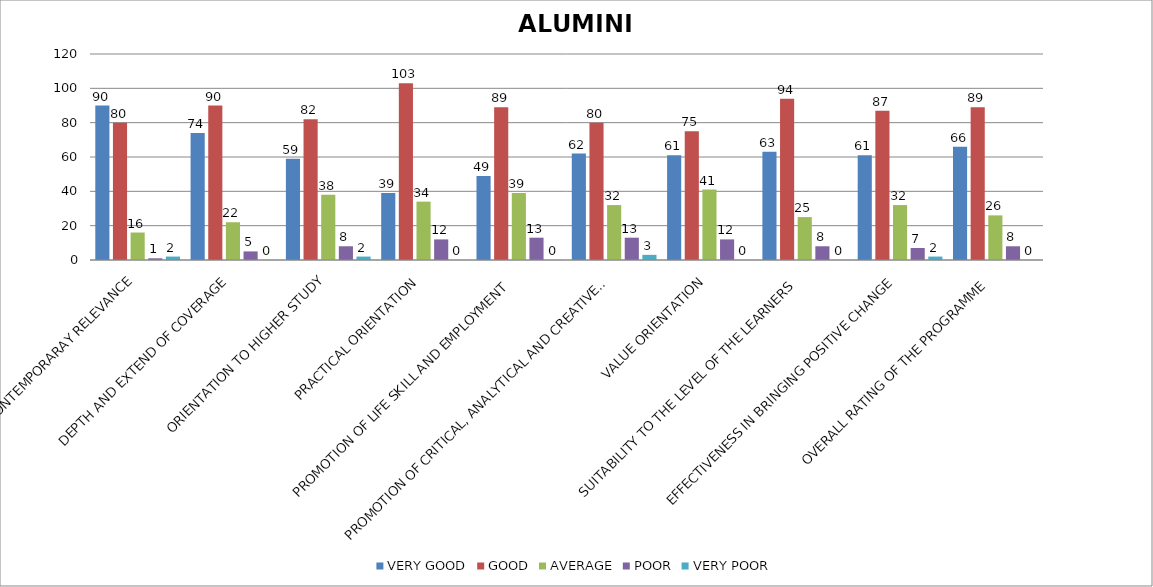
| Category | VERY GOOD | GOOD | AVERAGE | POOR | VERY POOR |
|---|---|---|---|---|---|
| CONTEMPORARAY RELEVANCE | 90 | 80 | 16 | 1 | 2 |
| DEPTH AND EXTEND OF COVERAGE | 74 | 90 | 22 | 5 | 0 |
| ORIENTATION TO HIGHER STUDY | 59 | 82 | 38 | 8 | 2 |
| PRACTICAL ORIENTATION | 39 | 103 | 34 | 12 | 0 |
| PROMOTION OF LIFE SKILL AND EMPLOYMENT | 49 | 89 | 39 | 13 | 0 |
| PROMOTION OF CRITICAL, ANALYTICAL AND CREATIVE THINKING | 62 | 80 | 32 | 13 | 3 |
| VALUE ORIENTATION | 61 | 75 | 41 | 12 | 0 |
| SUITABILITY TO THE LEVEL OF THE LEARNERS | 63 | 94 | 25 | 8 | 0 |
| EFFECTIVENESS IN BRINGING POSITIVE CHANGE | 61 | 87 | 32 | 7 | 2 |
| OVERALL RATING OF THE PROGRAMME | 66 | 89 | 26 | 8 | 0 |